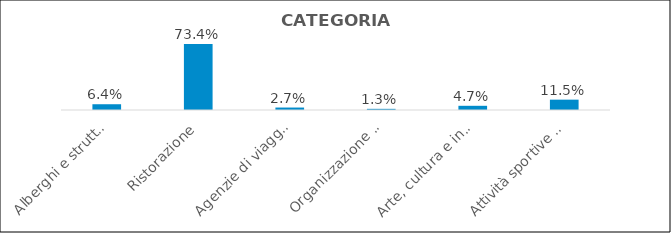
| Category | Series 0 |
|---|---|
| Alberghi e strutture ricettive | 0.064 |
| Ristorazione | 0.734 |
| Agenzie di viaggi e tour operator | 0.027 |
| Organizzazione di convegni e fiere | 0.013 |
| Arte, cultura e intrattenimento | 0.047 |
| Attività sportive e centri benessere | 0.115 |